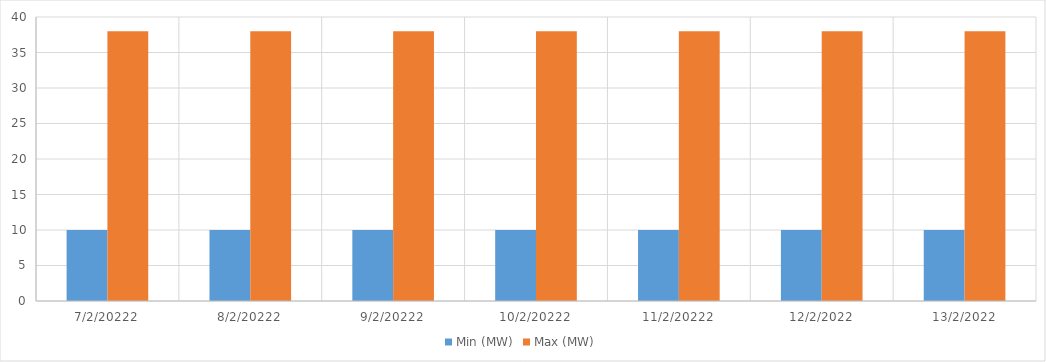
| Category | Min (MW) | Max (MW) |
|---|---|---|
| 7/2/20222 | 10 | 38 |
| 8/2/20222 | 10 | 38 |
| 9/2/20222 | 10 | 38 |
| 10/2/20222 | 10 | 38 |
| 11/2/20222 | 10 | 38 |
| 12/2/2022 | 10 | 38 |
| 13/2/2022 | 10 | 38 |